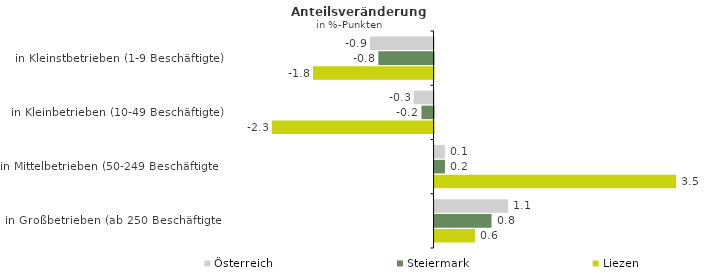
| Category | Österreich | Steiermark | Liezen |
|---|---|---|---|
| in Kleinstbetrieben (1-9 Beschäftigte) | -0.926 | -0.802 | -1.751 |
| in Kleinbetrieben (10-49 Beschäftigte) | -0.289 | -0.176 | -2.349 |
| in Mittelbetrieben (50-249 Beschäftigte) | 0.149 | 0.151 | 3.51 |
| in Großbetrieben (ab 250 Beschäftigte) | 1.066 | 0.827 | 0.589 |